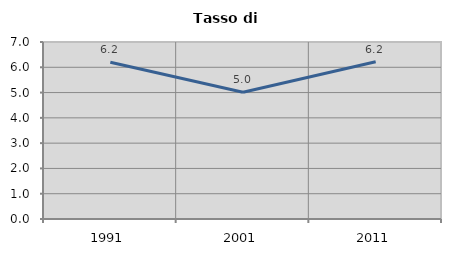
| Category | Tasso di disoccupazione   |
|---|---|
| 1991.0 | 6.197 |
| 2001.0 | 5.014 |
| 2011.0 | 6.221 |